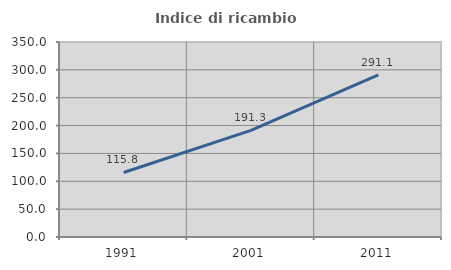
| Category | Indice di ricambio occupazionale  |
|---|---|
| 1991.0 | 115.789 |
| 2001.0 | 191.304 |
| 2011.0 | 291.111 |